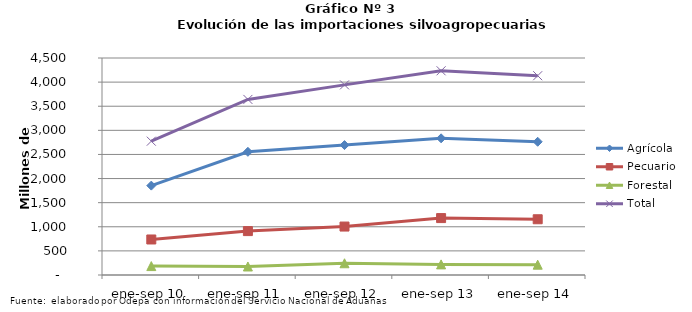
| Category | Agrícola | Pecuario | Forestal | Total |
|---|---|---|---|---|
| ene-sep 10 | 1853493 | 736504 | 184974 | 2774971 |
| ene-sep 11 | 2554417 | 910273 | 176496 | 3641186 |
| ene-sep 12 | 2694337 | 1004651 | 243502 | 3942490 |
| ene-sep 13 | 2834426 | 1180182 | 220233 | 4234841 |
| ene-sep 14 | 2762791 | 1156103 | 213974 | 4132868 |